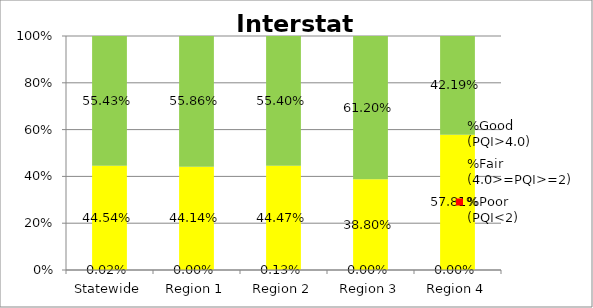
| Category | %Poor
(PQI<2) | %Fair
(4.0>=PQI>=2) | %Good
(PQI>4.0) |
|---|---|---|---|
| Statewide | 0 | 0.445 | 0.554 |
| Region 1 | 0 | 0.441 | 0.559 |
| Region 2 | 0.001 | 0.445 | 0.554 |
| Region 3 | 0 | 0.388 | 0.612 |
| Region 4 | 0 | 0.578 | 0.422 |